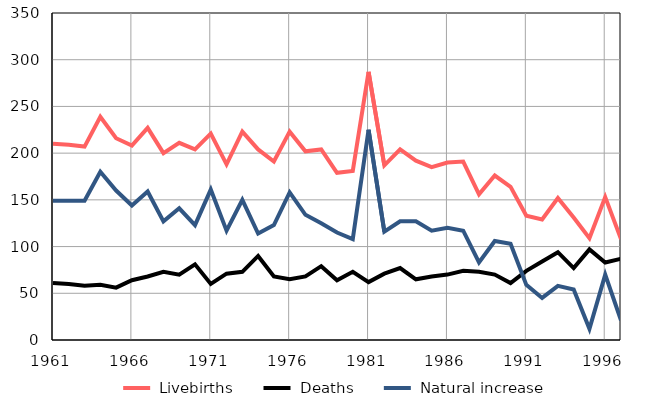
| Category |  Livebirths |  Deaths |  Natural increase |
|---|---|---|---|
| 1961.0 | 210 | 61 | 149 |
| 1962.0 | 209 | 60 | 149 |
| 1963.0 | 207 | 58 | 149 |
| 1964.0 | 239 | 59 | 180 |
| 1965.0 | 216 | 56 | 160 |
| 1966.0 | 208 | 64 | 144 |
| 1967.0 | 227 | 68 | 159 |
| 1968.0 | 200 | 73 | 127 |
| 1969.0 | 211 | 70 | 141 |
| 1970.0 | 204 | 81 | 123 |
| 1971.0 | 221 | 60 | 161 |
| 1972.0 | 188 | 71 | 117 |
| 1973.0 | 223 | 73 | 150 |
| 1974.0 | 204 | 90 | 114 |
| 1975.0 | 191 | 68 | 123 |
| 1976.0 | 223 | 65 | 158 |
| 1977.0 | 202 | 68 | 134 |
| 1978.0 | 204 | 79 | 125 |
| 1979.0 | 179 | 64 | 115 |
| 1980.0 | 181 | 73 | 108 |
| 1981.0 | 287 | 62 | 225 |
| 1982.0 | 187 | 71 | 116 |
| 1983.0 | 204 | 77 | 127 |
| 1984.0 | 192 | 65 | 127 |
| 1985.0 | 185 | 68 | 117 |
| 1986.0 | 190 | 70 | 120 |
| 1987.0 | 191 | 74 | 117 |
| 1988.0 | 156 | 73 | 83 |
| 1989.0 | 176 | 70 | 106 |
| 1990.0 | 164 | 61 | 103 |
| 1991.0 | 133 | 74 | 59 |
| 1992.0 | 129 | 84 | 45 |
| 1993.0 | 152 | 94 | 58 |
| 1994.0 | 131 | 77 | 54 |
| 1995.0 | 109 | 97 | 12 |
| 1996.0 | 153 | 83 | 70 |
| 1997.0 | 108 | 87 | 21 |